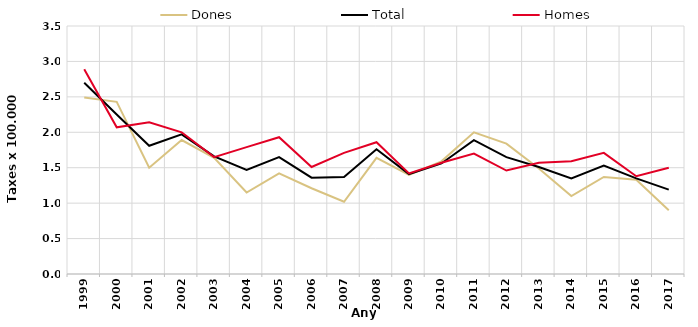
| Category | Dones | Total | Homes |
|---|---|---|---|
| 1999.0 | 2.49 | 2.7 | 2.89 |
| 2000.0 | 2.43 | 2.25 | 2.07 |
| 2001.0 | 1.5 | 1.81 | 2.14 |
| 2002.0 | 1.89 | 1.97 | 2 |
| 2003.0 | 1.64 | 1.66 | 1.65 |
| 2004.0 | 1.15 | 1.47 | 1.79 |
| 2005.0 | 1.42 | 1.65 | 1.93 |
| 2006.0 | 1.21 | 1.36 | 1.51 |
| 2007.0 | 1.02 | 1.37 | 1.71 |
| 2008.0 | 1.64 | 1.76 | 1.86 |
| 2009.0 | 1.4 | 1.41 | 1.42 |
| 2010.0 | 1.59 | 1.56 | 1.57 |
| 2011.0 | 2 | 1.89 | 1.7 |
| 2012.0 | 1.84 | 1.65 | 1.46 |
| 2013.0 | 1.49 | 1.51 | 1.57 |
| 2014.0 | 1.1 | 1.35 | 1.59 |
| 2015.0 | 1.37 | 1.53 | 1.71 |
| 2016.0 | 1.33 | 1.35 | 1.38 |
| 2017.0 | 0.9 | 1.19 | 1.5 |